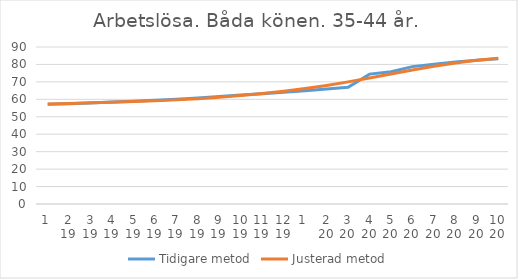
| Category | Tidigare metod | Justerad metod |
|---|---|---|
| 0 | 57.19 | 57.34 |
| 1 | 57.53 | 57.65 |
| 2 | 57.94 | 58 |
| 3 | 58.42 | 58.39 |
| 4 | 58.9 | 58.77 |
| 5 | 59.43 | 59.18 |
| 6 | 60.07 | 59.69 |
| 7 | 60.83 | 60.37 |
| 8 | 61.62 | 61.19 |
| 9 | 62.42 | 62.13 |
| 10 | 63.25 | 63.29 |
| 11 | 64.08 | 64.63 |
| 12 | 64.94 | 66.19 |
| 13 | 65.89 | 67.99 |
| 14 | 66.95 | 70 |
| 15 | 74.46 | 72.19 |
| 16 | 75.8 | 74.52 |
| 17 | 78.76 | 76.83 |
| 18 | 80.11 | 78.98 |
| 19 | 81.34 | 80.87 |
| 20 | 82.4 | 82.41 |
| 21 | 83.24 | 83.57 |